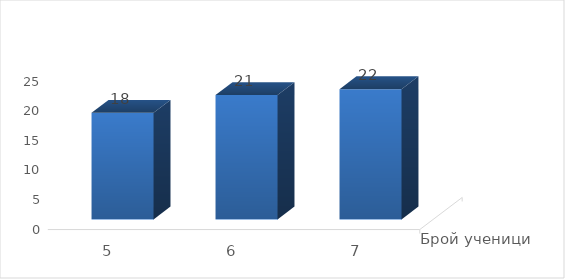
| Category | Брой ученици |
|---|---|
| 5.0 | 18 |
| 6.0 | 21 |
| 7.0 | 22 |